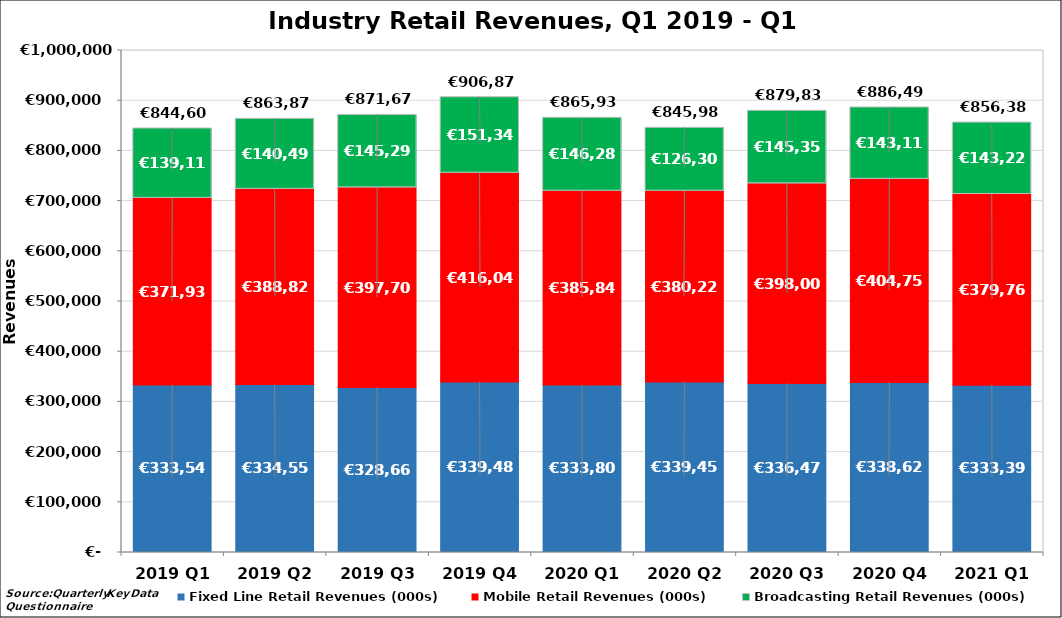
| Category | Fixed Line Retail Revenues (000s) | Mobile Retail Revenues (000s) | Broadcasting Retail Revenues (000s) |
|---|---|---|---|
| 2019 Q1 | 333546.469 | 371937.702 | 139116.768 |
| 2019 Q2 | 334555.661 | 388825.881 | 140493.699 |
| 2019 Q3 | 328666.506 | 397708.31 | 145297.666 |
| 2019 Q4 | 339487.178 | 416043.983 | 151346.492 |
| 2020 Q1 | 333808.414 | 385845.453 | 146283 |
| 2020 Q2 | 339452.93 | 380223 | 126307 |
| 2020 Q3 | 336479.251 | 398002 | 145352.467 |
| 2020 Q4 | 338628.139 | 404750.93 | 143115.932 |
| 2021 Q1 | 333394.119 | 379763.221 | 143225.728 |